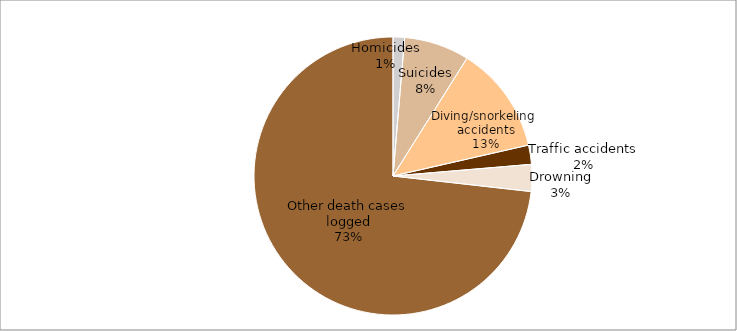
| Category | Series 0 |
|---|---|
| Homicides | 3 |
| Suicides | 17 |
| Diving/snorkeling  accidents | 28 |
| Traffic accidents | 5 |
| Drowning | 7 |
| Other death cases logged | 164 |